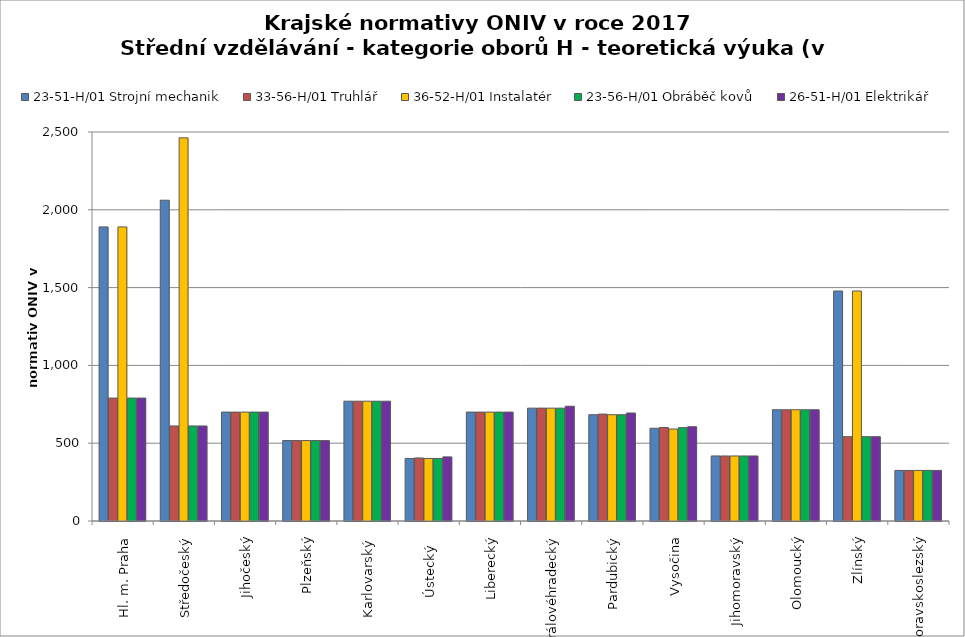
| Category | 23-51-H/01 Strojní mechanik | 33-56-H/01 Truhlář | 36-52-H/01 Instalatér | 23-56-H/01 Obráběč kovů | 26-51-H/01 Elektrikář |
|---|---|---|---|---|---|
| Hl. m. Praha | 1890 | 790 | 1890 | 790 | 790 |
| Středočeský | 2061.675 | 610.785 | 2462.368 | 610.785 | 610.785 |
| Jihočeský | 700 | 700 | 700 | 700 | 700 |
| Plzeňský | 517 | 517 | 517 | 517 | 517 |
| Karlovarský  | 770 | 770 | 770 | 770 | 770 |
| Ústecký   | 402 | 405 | 402 | 402 | 412 |
| Liberecký | 700 | 700 | 700 | 700 | 700 |
| Královéhradecký | 725.3 | 725.5 | 725.3 | 725.3 | 737.5 |
| Pardubický | 683 | 687 | 683 | 683 | 694 |
| Vysočina | 596 | 601 | 591 | 600 | 606 |
| Jihomoravský | 418 | 418 | 418 | 418 | 418 |
| Olomoucký | 715 | 715 | 715 | 715 | 715 |
| Zlínský | 1478 | 542 | 1478 | 542 | 542 |
| Moravskoslezský | 325 | 325 | 325 | 325 | 325 |